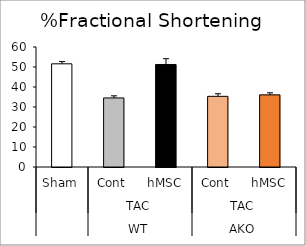
| Category | Series 0 |
|---|---|
| 0 | 51.59 |
| 1 | 34.536 |
| 2 | 51.263 |
| 3 | 35.332 |
| 4 | 36.067 |